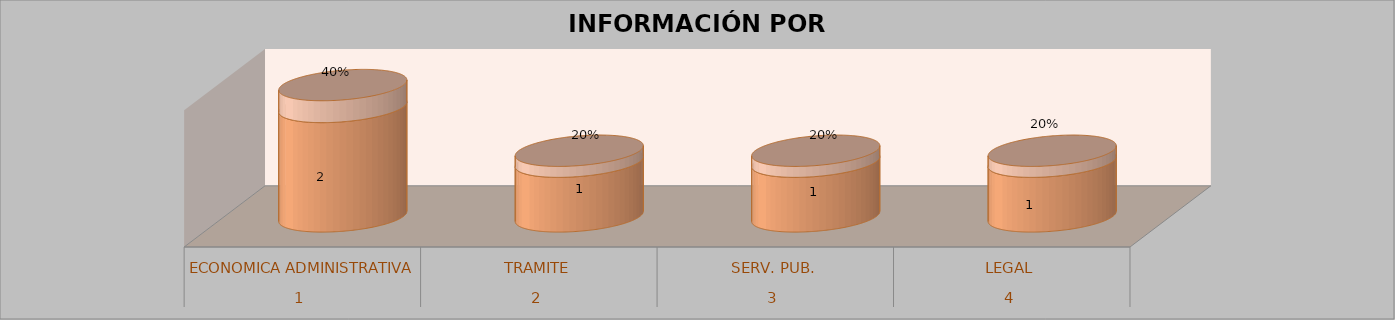
| Category | Series 0 | Series 1 | Series 2 | Series 3 |
|---|---|---|---|---|
| 0 |  |  | 2 | 0.4 |
| 1 |  |  | 1 | 0.2 |
| 2 |  |  | 1 | 0.2 |
| 3 |  |  | 1 | 0.2 |